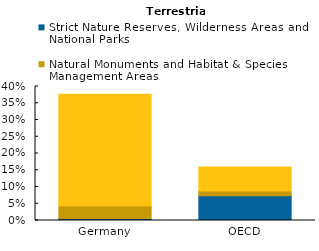
| Category | Strict Nature Reserves, Wilderness Areas and National Parks | Natural Monuments and Habitat & Species Management Areas | Protected areas with sustainable use of natural resources and areas with no management category provided |
|---|---|---|---|
| Germany | 0.006 | 0.037 | 0.334 |
| OECD | 0.074 | 0.015 | 0.071 |